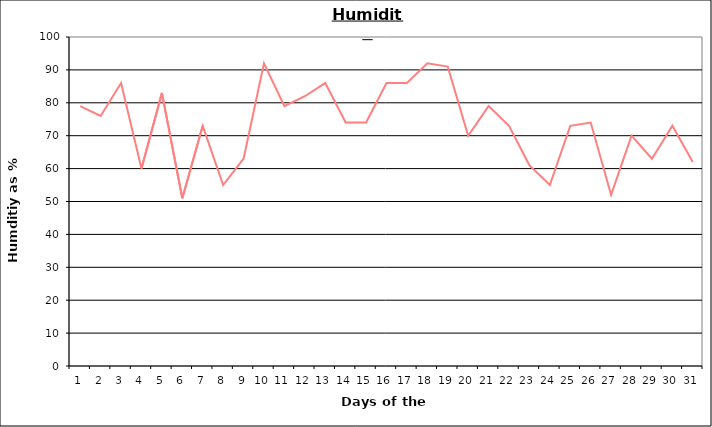
| Category | Series 0 |
|---|---|
| 0 | 79 |
| 1 | 76 |
| 2 | 86 |
| 3 | 60 |
| 4 | 83 |
| 5 | 51 |
| 6 | 73 |
| 7 | 55 |
| 8 | 63 |
| 9 | 92 |
| 10 | 79 |
| 11 | 82 |
| 12 | 86 |
| 13 | 74 |
| 14 | 74 |
| 15 | 86 |
| 16 | 86 |
| 17 | 92 |
| 18 | 91 |
| 19 | 70 |
| 20 | 79 |
| 21 | 73 |
| 22 | 61 |
| 23 | 55 |
| 24 | 73 |
| 25 | 74 |
| 26 | 52 |
| 27 | 70 |
| 28 | 63 |
| 29 | 73 |
| 30 | 62 |